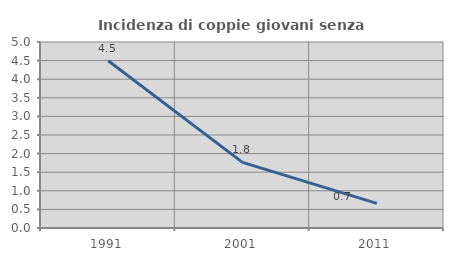
| Category | Incidenza di coppie giovani senza figli |
|---|---|
| 1991.0 | 4.494 |
| 2001.0 | 1.765 |
| 2011.0 | 0.662 |